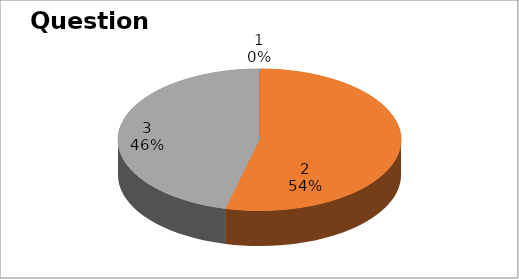
| Category | Series 0 |
|---|---|
| 0 | 0 |
| 1 | 21 |
| 2 | 18 |